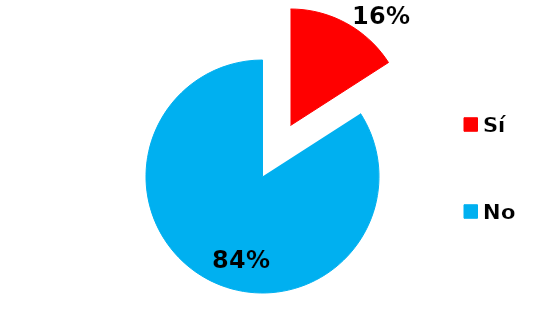
| Category | Series 0 |
|---|---|
| Sí | 7 |
| No | 37 |